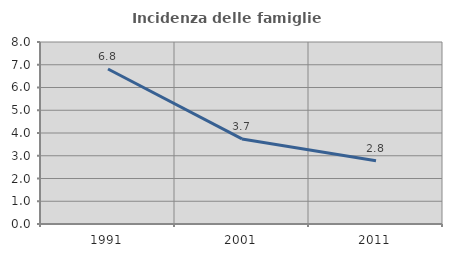
| Category | Incidenza delle famiglie numerose |
|---|---|
| 1991.0 | 6.812 |
| 2001.0 | 3.739 |
| 2011.0 | 2.784 |